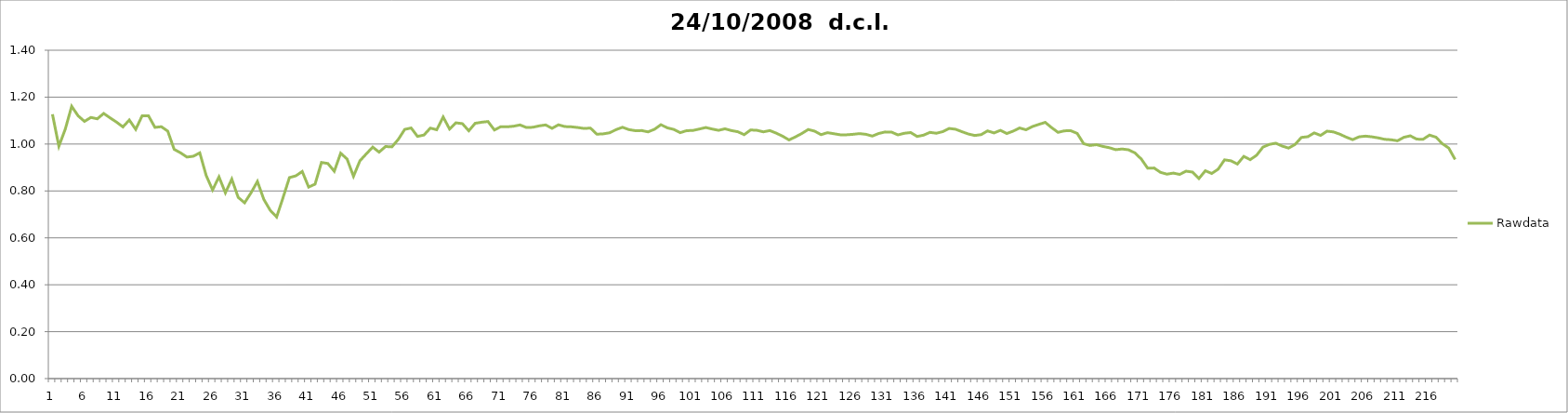
| Category | Rawdata |
|---|---|
| 0 | 1.127 |
| 1 | 0.991 |
| 2 | 1.064 |
| 3 | 1.161 |
| 4 | 1.121 |
| 5 | 1.096 |
| 6 | 1.114 |
| 7 | 1.108 |
| 8 | 1.13 |
| 9 | 1.112 |
| 10 | 1.094 |
| 11 | 1.073 |
| 12 | 1.102 |
| 13 | 1.062 |
| 14 | 1.121 |
| 15 | 1.12 |
| 16 | 1.071 |
| 17 | 1.074 |
| 18 | 1.055 |
| 19 | 0.978 |
| 20 | 0.962 |
| 21 | 0.944 |
| 22 | 0.948 |
| 23 | 0.963 |
| 24 | 0.866 |
| 25 | 0.804 |
| 26 | 0.86 |
| 27 | 0.792 |
| 28 | 0.85 |
| 29 | 0.772 |
| 30 | 0.75 |
| 31 | 0.792 |
| 32 | 0.84 |
| 33 | 0.764 |
| 34 | 0.718 |
| 35 | 0.689 |
| 36 | 0.772 |
| 37 | 0.857 |
| 38 | 0.864 |
| 39 | 0.883 |
| 40 | 0.816 |
| 41 | 0.829 |
| 42 | 0.922 |
| 43 | 0.917 |
| 44 | 0.884 |
| 45 | 0.961 |
| 46 | 0.936 |
| 47 | 0.862 |
| 48 | 0.929 |
| 49 | 0.958 |
| 50 | 0.987 |
| 51 | 0.966 |
| 52 | 0.99 |
| 53 | 0.988 |
| 54 | 1.02 |
| 55 | 1.062 |
| 56 | 1.068 |
| 57 | 1.032 |
| 58 | 1.038 |
| 59 | 1.068 |
| 60 | 1.061 |
| 61 | 1.116 |
| 62 | 1.064 |
| 63 | 1.09 |
| 64 | 1.087 |
| 65 | 1.056 |
| 66 | 1.088 |
| 67 | 1.093 |
| 68 | 1.096 |
| 69 | 1.06 |
| 70 | 1.074 |
| 71 | 1.074 |
| 72 | 1.076 |
| 73 | 1.082 |
| 74 | 1.07 |
| 75 | 1.072 |
| 76 | 1.078 |
| 77 | 1.082 |
| 78 | 1.067 |
| 79 | 1.082 |
| 80 | 1.074 |
| 81 | 1.074 |
| 82 | 1.07 |
| 83 | 1.066 |
| 84 | 1.068 |
| 85 | 1.042 |
| 86 | 1.043 |
| 87 | 1.048 |
| 88 | 1.062 |
| 89 | 1.072 |
| 90 | 1.062 |
| 91 | 1.057 |
| 92 | 1.058 |
| 93 | 1.052 |
| 94 | 1.063 |
| 95 | 1.082 |
| 96 | 1.069 |
| 97 | 1.062 |
| 98 | 1.048 |
| 99 | 1.057 |
| 100 | 1.058 |
| 101 | 1.064 |
| 102 | 1.07 |
| 103 | 1.064 |
| 104 | 1.058 |
| 105 | 1.065 |
| 106 | 1.057 |
| 107 | 1.052 |
| 108 | 1.04 |
| 109 | 1.06 |
| 110 | 1.058 |
| 111 | 1.052 |
| 112 | 1.058 |
| 113 | 1.046 |
| 114 | 1.034 |
| 115 | 1.018 |
| 116 | 1.03 |
| 117 | 1.045 |
| 118 | 1.062 |
| 119 | 1.055 |
| 120 | 1.04 |
| 121 | 1.048 |
| 122 | 1.044 |
| 123 | 1.04 |
| 124 | 1.04 |
| 125 | 1.041 |
| 126 | 1.044 |
| 127 | 1.042 |
| 128 | 1.034 |
| 129 | 1.045 |
| 130 | 1.051 |
| 131 | 1.051 |
| 132 | 1.039 |
| 133 | 1.046 |
| 134 | 1.049 |
| 135 | 1.032 |
| 136 | 1.038 |
| 137 | 1.05 |
| 138 | 1.046 |
| 139 | 1.053 |
| 140 | 1.066 |
| 141 | 1.063 |
| 142 | 1.053 |
| 143 | 1.043 |
| 144 | 1.036 |
| 145 | 1.04 |
| 146 | 1.056 |
| 147 | 1.047 |
| 148 | 1.058 |
| 149 | 1.045 |
| 150 | 1.055 |
| 151 | 1.068 |
| 152 | 1.061 |
| 153 | 1.074 |
| 154 | 1.084 |
| 155 | 1.092 |
| 156 | 1.07 |
| 157 | 1.05 |
| 158 | 1.056 |
| 159 | 1.057 |
| 160 | 1.045 |
| 161 | 1.002 |
| 162 | 0.994 |
| 163 | 0.997 |
| 164 | 0.99 |
| 165 | 0.984 |
| 166 | 0.976 |
| 167 | 0.979 |
| 168 | 0.976 |
| 169 | 0.962 |
| 170 | 0.936 |
| 171 | 0.897 |
| 172 | 0.898 |
| 173 | 0.879 |
| 174 | 0.872 |
| 175 | 0.876 |
| 176 | 0.87 |
| 177 | 0.884 |
| 178 | 0.88 |
| 179 | 0.853 |
| 180 | 0.886 |
| 181 | 0.874 |
| 182 | 0.893 |
| 183 | 0.933 |
| 184 | 0.929 |
| 185 | 0.915 |
| 186 | 0.947 |
| 187 | 0.933 |
| 188 | 0.952 |
| 189 | 0.987 |
| 190 | 0.998 |
| 191 | 1.004 |
| 192 | 0.991 |
| 193 | 0.983 |
| 194 | 0.998 |
| 195 | 1.028 |
| 196 | 1.031 |
| 197 | 1.048 |
| 198 | 1.037 |
| 199 | 1.055 |
| 200 | 1.052 |
| 201 | 1.042 |
| 202 | 1.029 |
| 203 | 1.019 |
| 204 | 1.031 |
| 205 | 1.034 |
| 206 | 1.031 |
| 207 | 1.026 |
| 208 | 1.02 |
| 209 | 1.018 |
| 210 | 1.014 |
| 211 | 1.029 |
| 212 | 1.035 |
| 213 | 1.021 |
| 214 | 1.02 |
| 215 | 1.038 |
| 216 | 1.029 |
| 217 | 1.002 |
| 218 | 0.983 |
| 219 | 0.934 |